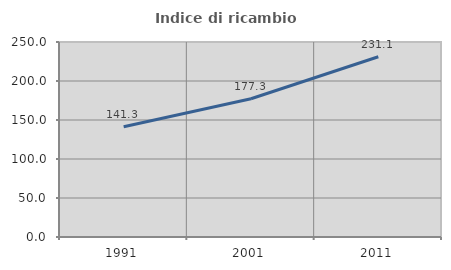
| Category | Indice di ricambio occupazionale  |
|---|---|
| 1991.0 | 141.326 |
| 2001.0 | 177.251 |
| 2011.0 | 231.131 |